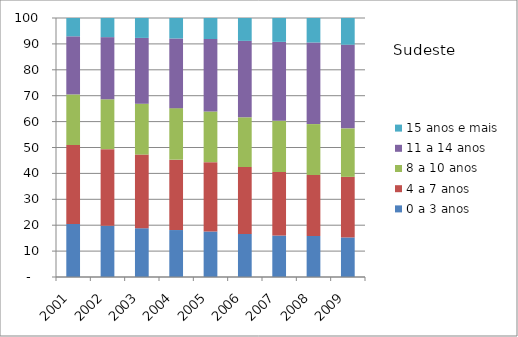
| Category | 0 a 3 anos | 4 a 7 anos | 8 a 10 anos | 11 a 14 anos | 15 anos e mais |
|---|---|---|---|---|---|
| 2001.0 | 20.49 | 30.48 | 19.53 | 22.43 | 7.08 |
| 2002.0 | 19.75 | 29.62 | 19.25 | 23.99 | 7.39 |
| 2003.0 | 18.83 | 28.44 | 19.67 | 25.37 | 7.7 |
| 2004.0 | 18.13 | 27.17 | 19.9 | 26.89 | 7.92 |
| 2005.0 | 17.57 | 26.77 | 19.57 | 27.98 | 8.12 |
| 2006.0 | 16.65 | 25.81 | 19.2 | 29.52 | 8.81 |
| 2007.0 | 16 | 24.53 | 19.84 | 30.41 | 9.22 |
| 2008.0 | 15.84 | 23.54 | 19.66 | 31.5 | 9.47 |
| 2009.0 | 15.28 | 23.38 | 18.73 | 32.29 | 10.32 |